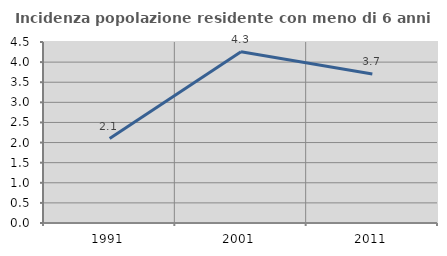
| Category | Incidenza popolazione residente con meno di 6 anni |
|---|---|
| 1991.0 | 2.1 |
| 2001.0 | 4.255 |
| 2011.0 | 3.704 |